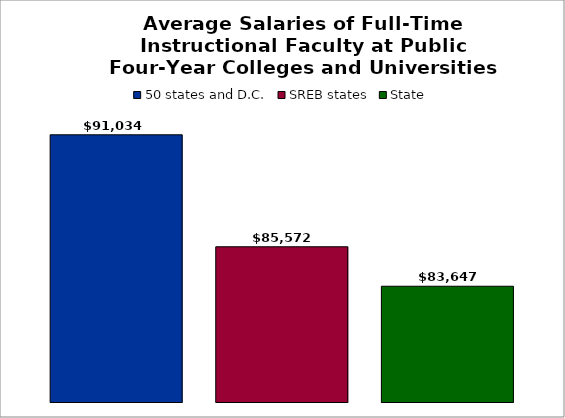
| Category | 50 states and D.C. | SREB states | State |
|---|---|---|---|
| 0 | 91033.679 | 85571.975 | 83647.058 |